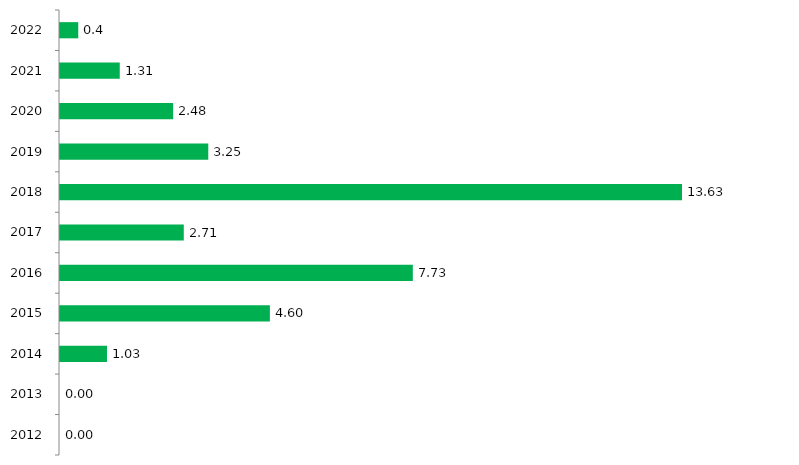
| Category | Series 1 |
|---|---|
| 2012.0 | 0 |
| 2013.0 | 0 |
| 2014.0 | 1.03 |
| 2015.0 | 4.6 |
| 2016.0 | 7.733 |
| 2017.0 | 2.713 |
| 2018.0 | 13.633 |
| 2019.0 | 3.25 |
| 2020.0 | 2.48 |
| 2021.0 | 1.31 |
| 2022.0 | 0.4 |